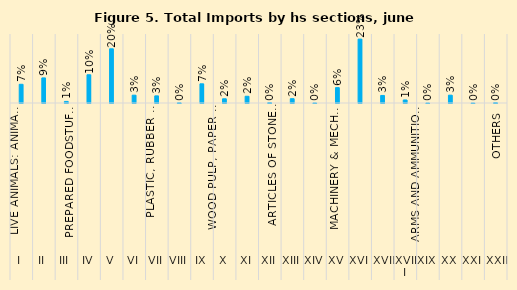
| Category | Series 0 |
|---|---|
| 0 | 0.068 |
| 1 | 0.091 |
| 2 | 0.006 |
| 3 | 0.102 |
| 4 | 0.196 |
| 5 | 0.028 |
| 6 | 0.026 |
| 7 | 0.001 |
| 8 | 0.069 |
| 9 | 0.015 |
| 10 | 0.024 |
| 11 | 0.002 |
| 12 | 0.016 |
| 13 | 0 |
| 14 | 0.056 |
| 15 | 0.232 |
| 16 | 0.027 |
| 17 | 0.011 |
| 18 | 0 |
| 19 | 0.028 |
| 20 | 0 |
| 21 | 0.001 |